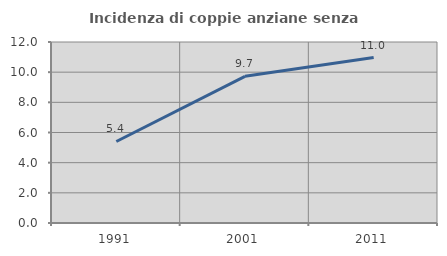
| Category | Incidenza di coppie anziane senza figli  |
|---|---|
| 1991.0 | 5.405 |
| 2001.0 | 9.722 |
| 2011.0 | 10.968 |